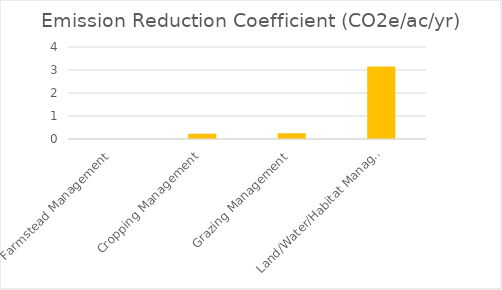
| Category | CO2e/ac/yr |
|---|---|
| Farmstead Management | 0 |
| Cropping Management | 0.23 |
| Grazing Management | 0.25 |
| Land/Water/Habitat Management | 3.152 |